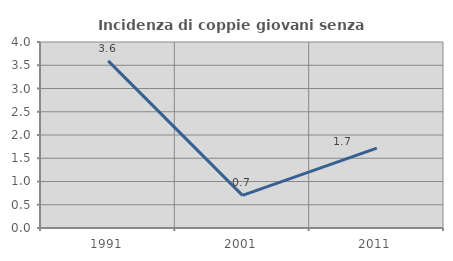
| Category | Incidenza di coppie giovani senza figli |
|---|---|
| 1991.0 | 3.593 |
| 2001.0 | 0.703 |
| 2011.0 | 1.719 |